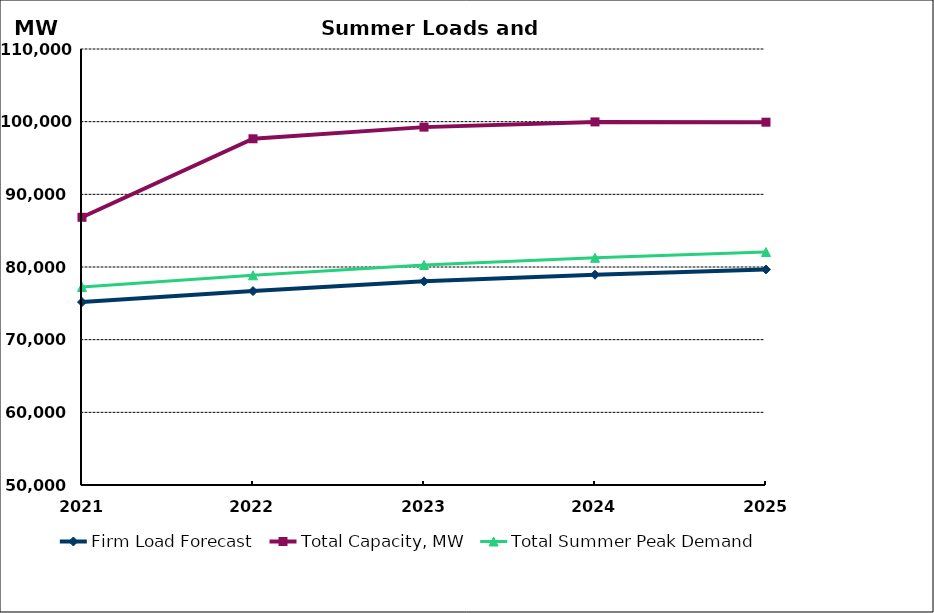
| Category | Firm Load Forecast | Total Capacity, MW | Total Summer Peak Demand |
|---|---|---|---|
| 2021.0 | 75173.179 | 86841.896 | 77243.638 |
| 2022.0 | 76694.792 | 97644.69 | 78855.251 |
| 2023.0 | 78029.833 | 99248.861 | 80280.292 |
| 2024.0 | 78936.984 | 99967.861 | 81266.818 |
| 2025.0 | 79661.213 | 99927.861 | 82057.638 |